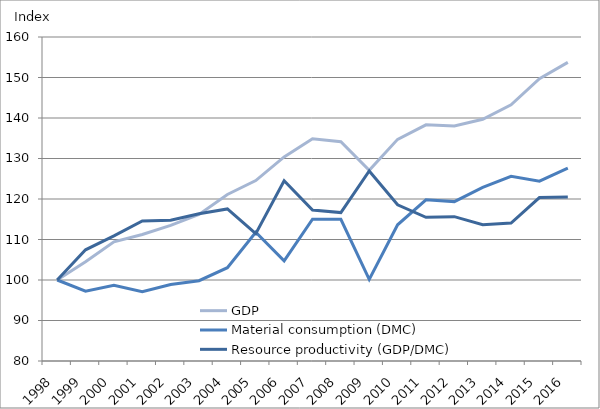
| Category | GDP | Material consumption (DMC) | Resource productivity (GDP/DMC) |
|---|---|---|---|
| 1998.0 | 100 | 100 | 100 |
| 1999.0 | 104.491 | 97.24 | 107.457 |
| 2000.0 | 109.431 | 98.687 | 110.887 |
| 2001.0 | 111.228 | 97.091 | 114.56 |
| 2002.0 | 113.473 | 98.893 | 114.743 |
| 2003.0 | 116.168 | 99.827 | 116.369 |
| 2004.0 | 121.108 | 103.031 | 117.546 |
| 2005.0 | 124.551 | 111.775 | 111.43 |
| 2006.0 | 130.389 | 104.739 | 124.49 |
| 2007.0 | 134.88 | 115.004 | 117.283 |
| 2008.0 | 134.132 | 114.997 | 116.639 |
| 2009.0 | 127.096 | 100.141 | 126.916 |
| 2010.0 | 134.731 | 113.635 | 118.564 |
| 2011.0 | 138.323 | 119.79 | 115.472 |
| 2012.0 | 138.024 | 119.353 | 115.644 |
| 2013.0 | 139.671 | 122.892 | 113.653 |
| 2014.0 | 143.263 | 125.62 | 114.045 |
| 2015.0 | 149.701 | 124.39 | 120.347 |
| 2016.0 | 153.743 | 127.621 | 120.468 |